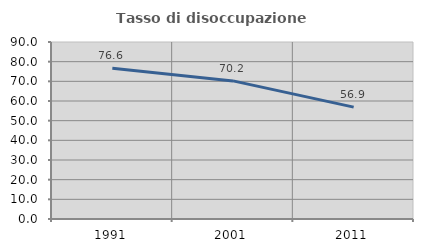
| Category | Tasso di disoccupazione giovanile  |
|---|---|
| 1991.0 | 76.614 |
| 2001.0 | 70.221 |
| 2011.0 | 56.897 |